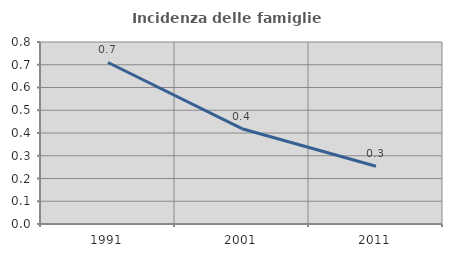
| Category | Incidenza delle famiglie numerose |
|---|---|
| 1991.0 | 0.71 |
| 2001.0 | 0.419 |
| 2011.0 | 0.254 |